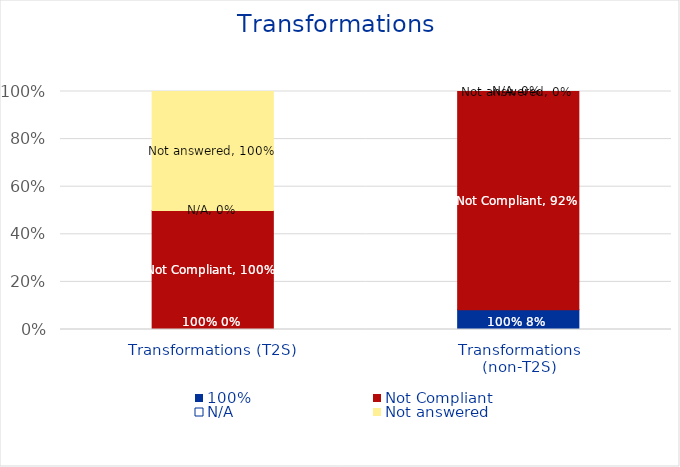
| Category | 100% | Not Compliant | N/A | Not answered |
|---|---|---|---|---|
| Transformations (T2S) | 0 | 1 | 0 | 1 |
| Transformations
(non-T2S) | 0.083 | 0.917 | 0 | 0 |